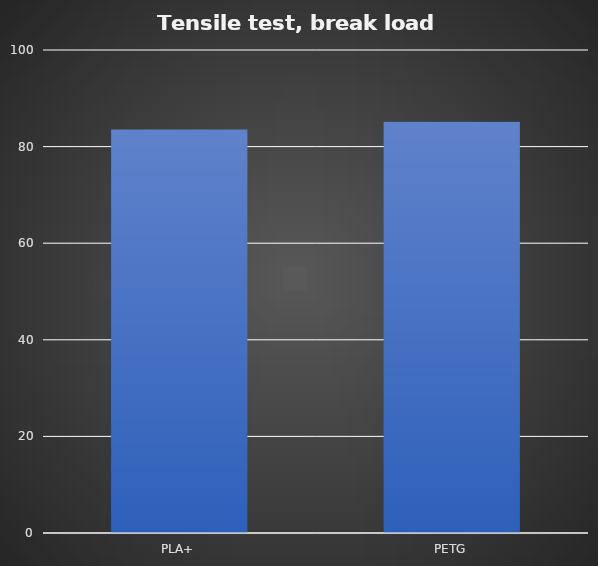
| Category | Average (kg) |
|---|---|
| PLA+ | 83.55 |
| PETG | 85.15 |